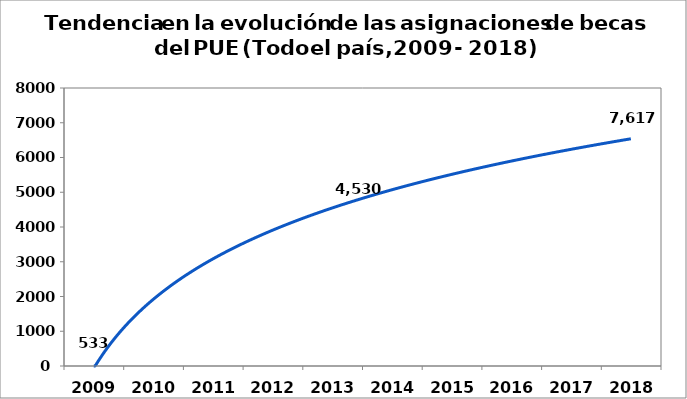
| Category | Series 1 |
|---|---|
| 2009.0 | 533 |
| 2010.0 | 2054 |
| 2011.0 | 2680 |
| 2012.0 | 2778 |
| 2013.0 | 4530 |
| 2014.0 | 4944 |
| 2015.0 | 5127 |
| 2016.0 | 7104 |
| 2017.0 | 5315 |
| 2018.0 | 7617 |